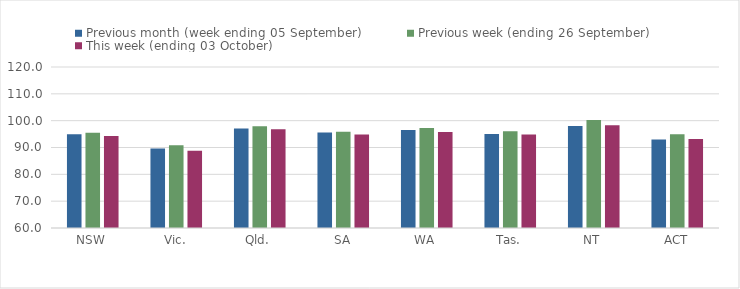
| Category | Previous month (week ending 05 September) | Previous week (ending 26 September) | This week (ending 03 October) |
|---|---|---|---|
| NSW | 94.9 | 95.53 | 94.25 |
| Vic. | 89.61 | 90.82 | 88.75 |
| Qld. | 97.04 | 97.95 | 96.81 |
| SA | 95.63 | 95.89 | 94.85 |
| WA | 96.56 | 97.29 | 95.78 |
| Tas. | 95.02 | 96.03 | 94.83 |
| NT | 97.99 | 100.24 | 98.27 |
| ACT | 92.98 | 94.97 | 93.19 |